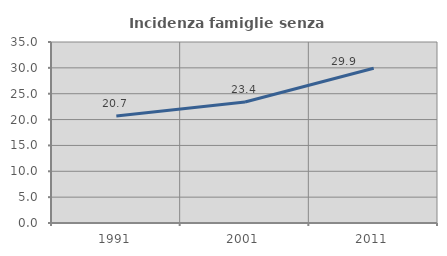
| Category | Incidenza famiglie senza nuclei |
|---|---|
| 1991.0 | 20.69 |
| 2001.0 | 23.383 |
| 2011.0 | 29.923 |